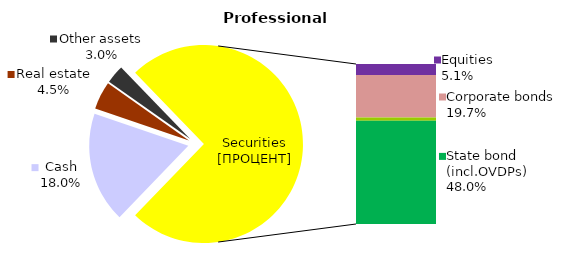
| Category | Professional |
|---|---|
| Cash | 27.808 |
| Bank metals | 0 |
| Real estate | 7.006 |
| Other assets | 4.638 |
| Equities | 7.887 |
| Corporate bonds | 30.48 |
| Municipal bonds | 2.407 |
| State bond (incl.OVDPs) | 74.102 |